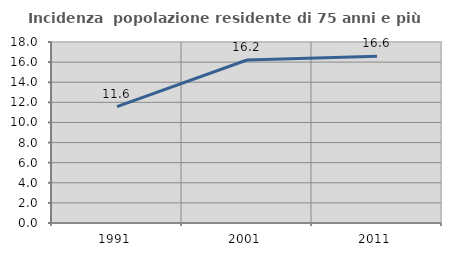
| Category | Incidenza  popolazione residente di 75 anni e più |
|---|---|
| 1991.0 | 11.568 |
| 2001.0 | 16.21 |
| 2011.0 | 16.576 |